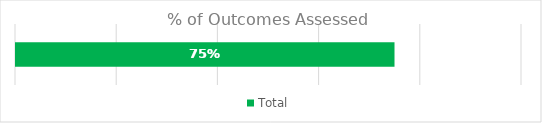
| Category | Total |
|---|---|
| 0 | 0.75 |